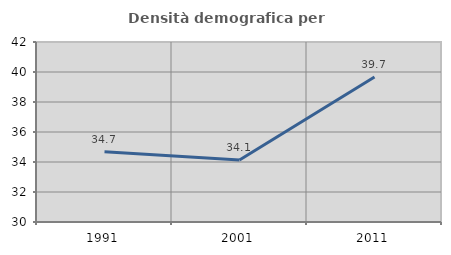
| Category | Densità demografica |
|---|---|
| 1991.0 | 34.676 |
| 2001.0 | 34.128 |
| 2011.0 | 39.664 |